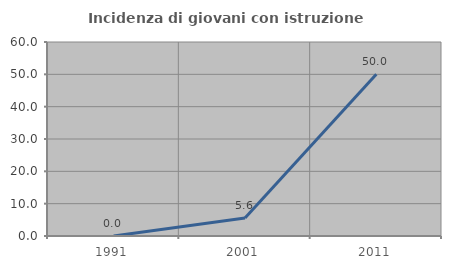
| Category | Incidenza di giovani con istruzione universitaria |
|---|---|
| 1991.0 | 0 |
| 2001.0 | 5.556 |
| 2011.0 | 50 |